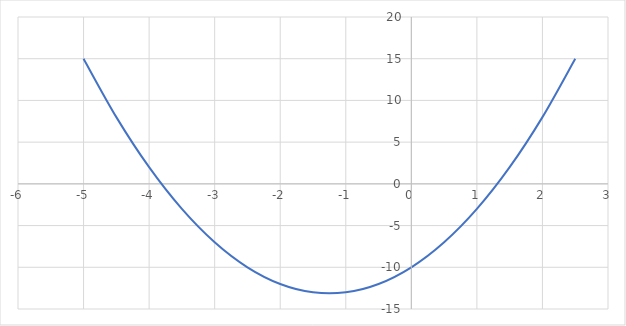
| Category | Series 0 |
|---|---|
| -5.0 | 15 |
| -4.5 | 8 |
| -4.0 | 2 |
| -3.5 | -3 |
| -3.0 | -7 |
| -2.5 | -10 |
| -2.0 | -12 |
| -1.5 | -13 |
| -1.0 | -13 |
| -0.5 | -12 |
| 0.0 | -10 |
| 0.5 | -7 |
| 1.0 | -3 |
| 1.5 | 2 |
| 2.0 | 8 |
| 2.5 | 15 |